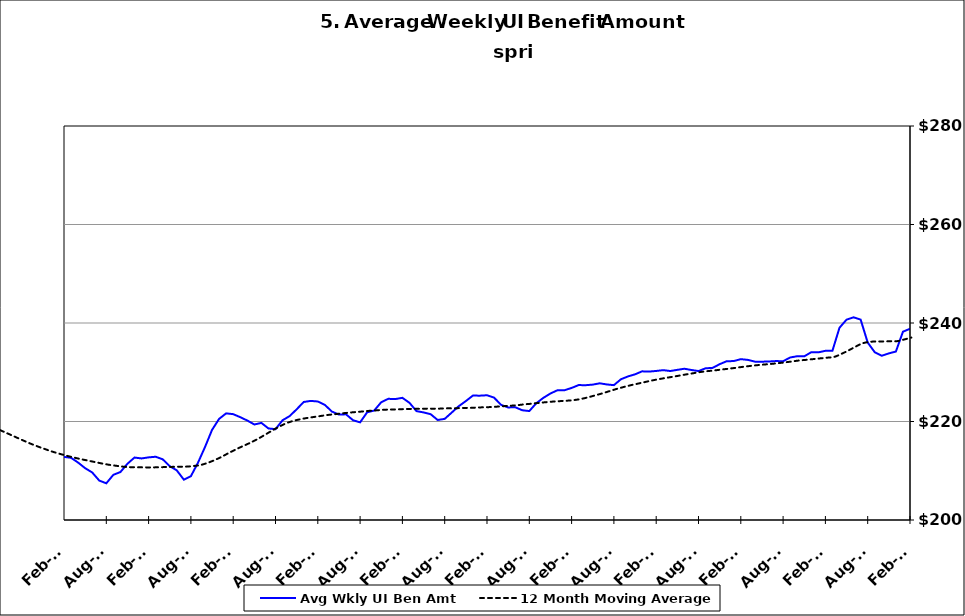
| Category | Avg Wkly UI Ben Amt |
|---|---|
| 1995-01-31 | 152.517 |
| 1995-02-28 | 151.164 |
| 1995-03-31 | 148.4 |
| 1995-04-30 | 146.034 |
| 1995-05-31 | 146.738 |
| 1995-06-30 | 147.885 |
| 1995-07-31 | 145.798 |
| 1995-08-31 | 144.052 |
| 1995-09-30 | 147.334 |
| 1995-10-31 | 151.535 |
| 1995-11-30 | 152.903 |
| 1995-12-31 | 153.258 |
| 1996-01-15 | 153.468 |
| 1996-02-15 | 153.032 |
| 1996-03-15 | 155.453 |
| 1996-04-15 | 148.614 |
| 1996-05-15 | 148.648 |
| 1996-06-15 | 150.145 |
| 1996-07-15 | 147.052 |
| 1996-08-15 | 146.042 |
| 1996-09-15 | 149.978 |
| 1996-10-15 | 151.319 |
| 1996-11-15 | 153.295 |
| 1996-12-15 | 155.775 |
| 1997-01-15 | 154.813 |
| 1997-02-15 | 151.102 |
| 1997-03-15 | 149.222 |
| 1997-04-15 | 145.178 |
| 1997-05-31 | 145.194 |
| 1997-06-30 | 146.718 |
| 1997-07-31 | 142.224 |
| 1997-08-31 | 142.382 |
| 1997-09-30 | 143.123 |
| 1997-10-31 | 146.797 |
| 1997-11-30 | 148.163 |
| 1997-12-31 | 147.967 |
| 1998-01-31 | 147.87 |
| 1998-02-28 | 147.591 |
| 1998-03-31 | 147.262 |
| 1998-04-30 | 144.746 |
| 1998-05-31 | 146.093 |
| 1998-06-30 | 147.355 |
| 1998-07-31 | 146.079 |
| 1998-08-31 | 147.387 |
| 1998-09-30 | 147.529 |
| 1998-10-31 | 152.825 |
| 1998-11-30 | 156.171 |
| 1998-12-31 | 156.424 |
| 1999-01-31 | 157.388 |
| 1999-02-28 | 157.868 |
| 1999-03-31 | 157.505 |
| 1999-04-30 | 153.987 |
| 1999-05-31 | 153.665 |
| 1999-06-30 | 153.746 |
| 1999-07-31 | 154.09 |
| 1999-08-31 | 156.162 |
| 1999-09-30 | 157.136 |
| 1999-10-31 | 162.476 |
| 1999-11-30 | 163.291 |
| 1999-12-31 | 165.621 |
| 2000-01-31 | 166.425 |
| 2000-02-29 | 165.378 |
| 2000-03-31 | 163.05 |
| 2000-04-30 | 161.908 |
| 2000-05-31 | 160.484 |
| 2000-06-30 | 160.865 |
| 2000-07-31 | 161.011 |
| 2000-08-31 | 158.845 |
| 2000-09-30 | 161.127 |
| 2000-10-31 | 163.997 |
| 2000-11-30 | 164.759 |
| 2000-12-31 | 166.66 |
| 2001-01-31 | 168.164 |
| 2001-02-28 | 169.339 |
| 2001-03-31 | 169.617 |
| 2001-04-30 | 170.349 |
| 2001-05-31 | 168.417 |
| 2001-06-30 | 169.418 |
| 2001-07-31 | 169.733 |
| 2001-08-31 | 170.578 |
| 2001-09-30 | 174.36 |
| 2001-10-31 | 176.952 |
| 2001-11-30 | 178.489 |
| 2001-12-31 | 179.805 |
| 2002-01-31 | 179.529 |
| 2002-02-28 | 179.269 |
| 2002-03-31 | 178.588 |
| 2002-04-30 | 177.594 |
| 2002-05-31 | 175.021 |
| 2002-06-30 | 175.298 |
| 2002-07-31 | 173.853 |
| 2002-08-31 | 172.776 |
| 2002-09-30 | 174.657 |
| 2002-10-31 | 175.648 |
| 2002-11-30 | 176.299 |
| 2002-12-31 | 177.239 |
| 2003-01-31 | 176.943 |
| 2003-02-28 | 176.988 |
| 2003-03-31 | 175.698 |
| 2003-04-30 | 172.857 |
| 2003-05-31 | 171.934 |
| 2003-06-30 | 171.956 |
| 2003-07-31 | 170.949 |
| 2003-08-31 | 171.311 |
| 2003-09-30 | 171.909 |
| 2003-10-31 | 172.692 |
| 2003-11-30 | 173.689 |
| 2003-12-31 | 174.176 |
| 2004-01-31 | 173.867 |
| 2004-02-29 | 173.648 |
| 2004-03-31 | 172.152 |
| 2004-04-30 | 170.705 |
| 2004-05-31 | 170.684 |
| 2004-06-30 | 170.635 |
| 2004-07-31 | 171.229 |
| 2004-08-31 | 175.375 |
| 2004-09-30 | 182.737 |
| 2004-10-31 | 187.554 |
| 2004-11-30 | 191.316 |
| 2004-12-31 | 194.602 |
| 2005-01-31 | 196.38 |
| 2005-02-28 | 196.569 |
| 2005-03-31 | 195.523 |
| 2005-04-30 | 193.655 |
| 2005-05-31 | 193.953 |
| 2005-06-30 | 192.728 |
| 2005-07-31 | 192.211 |
| 2005-08-31 | 191.133 |
| 2005-09-30 | 194.339 |
| 2005-10-31 | 196.819 |
| 2005-11-30 | 198.473 |
| 2005-12-31 | 199.545 |
| 2006-01-31 | 199.965 |
| 2006-02-28 | 200.117 |
| 2006-03-31 | 198.335 |
| 2006-04-30 | 197.258 |
| 2006-05-31 | 195.225 |
| 2006-06-30 | 195.734 |
| 2006-07-31 | 194.92 |
| 2006-08-31 | 194.282 |
| 2006-09-30 | 196.801 |
| 2006-10-31 | 199.137 |
| 2006-11-30 | 201.183 |
| 2006-12-31 | 202.121 |
| 2007-01-31 | 202.615 |
| 2007-02-28 | 202.465 |
| 2007-03-31 | 201.75 |
| 2007-04-30 | 200.344 |
| 2007-05-31 | 198.851 |
| 2007-06-30 | 198.258 |
| 2007-07-30 | 197.654 |
| 2007-08-31 | 198.405 |
| 2007-09-30 | 200.563 |
| 2007-10-31 | 201.857 |
| 2007-11-15 | 203.345 |
| 2007-12-15 09:36:00 | 219.243 |
| 2008-01-14 19:12:00 | 219.658 |
| 2008-02-14 04:48:00 | 220.121 |
| 2008-03-15 14:24:00 | 219.456 |
| 2008-04-15 | 217.672 |
| 2008-05-15 09:36:00 | 216.637 |
| 2008-06-14 19:12:00 | 216.035 |
| 2008-07-15 04:48:00 | 213.916 |
| 2008-08-14 14:24:00 | 214.008 |
| 2008-09-14 | 216.475 |
| 2008-10-14 09:36:00 | 217.836 |
| 2008-11-13 19:12:00 | 219.819 |
| 2008-12-14 04:48:00 | 221.529 |
| 2009-01-13 14:24:00 | 222.143 |
| 2009-02-13 | 222.091 |
| 2009-03-15 09:36:00 | 222.273 |
| 2009-04-14 19:12:00 | 222.011 |
| 2009-05-15 04:48:00 | 221.558 |
| 2009-06-14 14:24:00 | 220.761 |
| 2009-07-15 | 219.225 |
| 2009-08-14 09:36:00 | 218.364 |
| 2009-09-13 19:12:00 | 218.814 |
| 2009-10-14 04:48:00 | 218.744 |
| 2009-11-13 14:24:00 | 218.719 |
| 2009-12-14 | 218.779 |
| 2010-01-13 09:36:00 | 217.988 |
| 2010-02-12 19:12:00 | 217.521 |
| 2010-03-15 04:48:00 | 216.93 |
| 2010-04-14 14:24:00 | 215.638 |
| 2010-05-15 | 213.953 |
| 2010-06-14 09:36:00 | 213.326 |
| 2010-07-14 19:12:00 | 211.48 |
| 2010-08-14 04:48:00 | 210.615 |
| 2010-09-13 14:24:00 | 211.554 |
| 2010-10-14 | 211.956 |
| 2010-11-13 09:36:00 | 212.619 |
| 2010-12-13 19:12:00 | 212.979 |
| 2011-01-13 04:48:00 | 212.778 |
| 2011-02-12 14:24:00 | 212.812 |
| 2011-03-15 | 212.631 |
| 2011-04-14 09:36:00 | 211.659 |
| 2011-05-14 19:12:00 | 210.522 |
| 2011-06-14 04:48:00 | 209.652 |
| 2011-07-14 14:24:00 | 208.005 |
| 2011-08-14 | 207.451 |
| 2011-09-13 09:36:00 | 209.173 |
| 2011-10-13 19:12:00 | 209.736 |
| 2011-11-13 04:48:00 | 211.422 |
| 2011-12-13 14:24:00 | 212.679 |
| 2012-01-13 | 212.502 |
| 2012-02-12 09:36:00 | 212.715 |
| 2012-03-13 19:12:00 | 212.846 |
| 2012-04-13 04:48:00 | 212.323 |
| 2012-05-13 14:24:00 | 210.934 |
| 2012-06-13 | 210.073 |
| 2012-07-13 09:36:00 | 208.192 |
| 2012-08-12 19:12:00 | 208.902 |
| 2012-09-12 04:48:00 | 211.616 |
| 2012-10-12 14:24:00 | 214.814 |
| 2012-11-12 | 218.296 |
| 2012-12-12 09:36:00 | 220.532 |
| 2013-01-11 19:12:00 | 221.653 |
| 2013-02-11 04:48:00 | 221.49 |
| 2013-03-13 14:24:00 | 220.877 |
| 2013-04-13 | 220.198 |
| 2013-05-13 09:36:00 | 219.395 |
| 2013-06-12 19:12:00 | 219.716 |
| 2013-07-13 04:48:00 | 218.588 |
| 2013-08-12 14:24:00 | 218.444 |
| 2013-09-12 | 220.248 |
| 2013-10-12 09:36:00 | 221.094 |
| 2013-11-11 19:12:00 | 222.471 |
| 2013-12-12 04:48:00 | 223.964 |
| 2014-01-11 14:24:00 | 224.183 |
| 2014-02-11 | 224.065 |
| 2014-03-13 09:36:00 | 223.376 |
| 2014-04-12 19:12:00 | 222.017 |
| 2014-05-13 04:48:00 | 221.409 |
| 2014-06-12 14:24:00 | 221.458 |
| 2014-07-13 | 220.256 |
| 2014-08-12 09:36:00 | 219.823 |
| 2014-09-11 19:12:00 | 221.87 |
| 2014-10-12 04:48:00 | 222.223 |
| 2014-11-11 14:24:00 | 223.919 |
| 2014-12-12 | 224.606 |
| 2015-01-11 09:36:00 | 224.554 |
| 2015-02-10 19:12:00 | 224.808 |
| 2015-03-13 04:48:00 | 223.795 |
| 2015-04-12 14:24:00 | 222.11 |
| 2015-05-13 | 221.845 |
| 2015-06-12 09:36:00 | 221.492 |
| 2015-07-12 19:12:00 | 220.308 |
| 2015-08-12 04:48:00 | 220.534 |
| 2015-09-11 14:24:00 | 221.819 |
| 2015-10-12 | 223.117 |
| 2015-11-11 09:36:00 | 224.146 |
| 2015-12-11 19:12:00 | 225.264 |
| 2016-01-11 04:48:00 | 225.247 |
| 2016-02-10 14:24:00 | 225.331 |
| 2016-03-12 | 224.849 |
| 2016-04-11 09:36:00 | 223.376 |
| 2016-05-11 19:12:00 | 222.856 |
| 2016-06-11 04:48:00 | 222.895 |
| 2016-07-11 14:24:00 | 222.285 |
| 2016-08-11 | 222.119 |
| 2016-09-10 09:36:00 | 223.72 |
| 2016-10-10 19:12:00 | 224.805 |
| 2016-11-10 04:48:00 | 225.687 |
| 2016-12-10 14:24:00 | 226.349 |
| 2017-01-10 | 226.348 |
| 2017-02-09 09:36:00 | 226.816 |
| 2017-03-11 19:12:00 | 227.395 |
| 2017-04-11 04:48:00 | 227.37 |
| 2017-05-11 14:24:00 | 227.492 |
| 2017-06-11 | 227.755 |
| 2017-07-11 09:36:00 | 227.522 |
| 2017-08-10 19:12:00 | 227.382 |
| 2017-09-10 04:48:00 | 228.581 |
| 2017-10-10 14:24:00 | 229.154 |
| 2017-11-10 | 229.58 |
| 2017-12-10 09:36:00 | 230.186 |
| 2018-01-09 19:12:00 | 230.136 |
| 2018-02-09 04:48:00 | 230.265 |
| 2018-03-11 14:24:00 | 230.427 |
| 2018-04-11 | 230.25 |
| 2018-05-11 09:36:00 | 230.487 |
| 2018-06-10 19:12:00 | 230.714 |
| 2018-07-11 04:48:00 | 230.457 |
| 2018-08-10 14:24:00 | 230.244 |
| 2018-09-10 | 230.802 |
| 2018-10-10 09:36:00 | 230.887 |
| 2018-11-09 19:12:00 | 231.636 |
| 2018-12-10 04:48:00 | 232.24 |
| 2019-01-09 14:24:00 | 232.268 |
| 2019-02-09 | 232.662 |
| 2019-03-11 09:36:00 | 232.508 |
| 2019-04-10 19:12:00 | 232.152 |
| 2019-05-11 04:48:00 | 232.145 |
| 2019-06-10 14:24:00 | 232.186 |
| 2019-07-11 | 232.27 |
| 2019-08-10 09:36:00 | 232.238 |
| 2019-09-09 19:12:00 | 232.999 |
| 2019-10-10 04:48:00 | 233.25 |
| 2019-11-09 14:24:00 | 233.231 |
| 2019-12-10 | 234.074 |
| 2020-01-09 09:36:00 | 234.041 |
| 2020-02-08 19:12:00 | 234.352 |
| 2020-03-10 04:48:00 | 234.377 |
| 2020-04-09 14:24:00 | 239.041 |
| 2020-05-10 | 240.685 |
| 2020-06-09 09:36:00 | 241.153 |
| 2020-07-09 19:12:00 | 240.685 |
| 2020-08-09 04:48:00 | 236.032 |
| 2020-09-08 14:24:00 | 234.062 |
| 2020-10-09 | 233.35 |
| 2020-11-08 09:36:00 | 233.83 |
| 2020-12-08 19:12:00 | 234.208 |
| 2021-01-08 04:48:00 | 238.23 |
| 2021-02-07 14:24:00 | 238.83 |